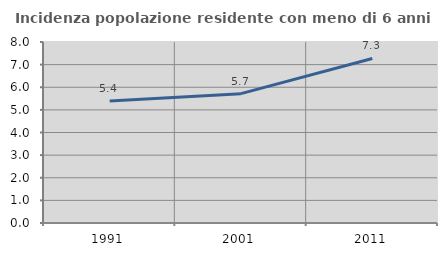
| Category | Incidenza popolazione residente con meno di 6 anni |
|---|---|
| 1991.0 | 5.387 |
| 2001.0 | 5.718 |
| 2011.0 | 7.273 |